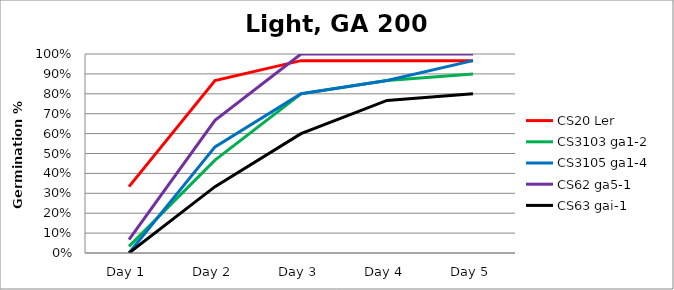
| Category | CS20 Ler | CS3103 ga1-2 | CS3105 ga1-4  | CS62 ga5-1 | CS63 gai-1 |
|---|---|---|---|---|---|
| Day 1 | 0.333 | 0.033 | 0 | 0.067 | 0 |
| Day 2 | 0.867 | 0.467 | 0.533 | 0.667 | 0.333 |
| Day 3 | 0.967 | 0.8 | 0.8 | 1 | 0.6 |
| Day 4 | 0.967 | 0.867 | 0.867 | 1 | 0.767 |
| Day 5 | 0.967 | 0.9 | 0.967 | 1 | 0.8 |